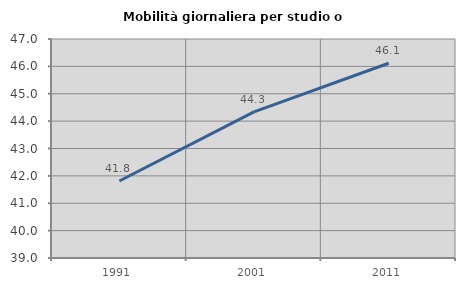
| Category | Mobilità giornaliera per studio o lavoro |
|---|---|
| 1991.0 | 41.814 |
| 2001.0 | 44.339 |
| 2011.0 | 46.115 |